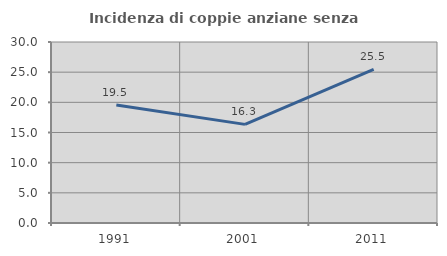
| Category | Incidenza di coppie anziane senza figli  |
|---|---|
| 1991.0 | 19.54 |
| 2001.0 | 16.346 |
| 2011.0 | 25.455 |